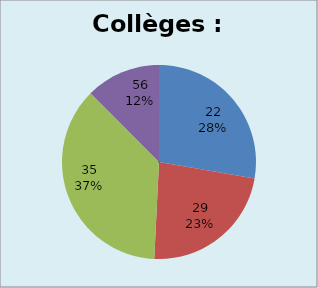
| Category | Collèges |
|---|---|
| 22.0 | 89 |
| 29.0 | 74 |
| 35.0 | 118 |
| 56.0 | 40 |